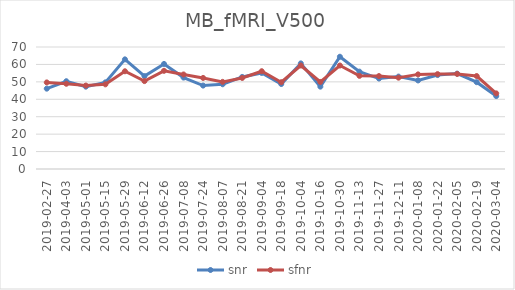
| Category | snr | sfnr |
|---|---|---|
| 2019-02-27 | 46.099 | 49.675 |
| 2019-04-03 | 50.358 | 48.905 |
| 2019-05-01 | 47.243 | 47.873 |
| 2019-05-15 | 49.707 | 48.575 |
| 2019-05-29 | 62.908 | 56.077 |
| 2019-06-12 | 53.31 | 50.439 |
| 2019-06-26 | 60.285 | 56.342 |
| 2019-07-08 | 52.454 | 54.242 |
| 2019-07-24 | 47.863 | 52.256 |
| 2019-08-07 | 48.623 | 49.999 |
| 2019-08-21 | 52.822 | 52.238 |
| 2019-09-04 | 55.11 | 56.106 |
| 2019-09-18 | 48.754 | 49.803 |
| 2019-10-04 | 60.599 | 59.389 |
| 2019-10-16 | 47.256 | 49.949 |
| 2019-10-30 | 64.409 | 59.371 |
| 2019-11-13 | 55.863 | 53.445 |
| 2019-11-27 | 51.898 | 53.321 |
| 2019-12-11 | 53.028 | 52.409 |
| 2020-01-08 | 50.811 | 54.29 |
| 2020-01-22 | 53.898 | 54.437 |
| 2020-02-05 | 54.725 | 54.536 |
| 2020-02-19 | 49.814 | 53.339 |
| 2020-03-04 | 41.839 | 43.399 |